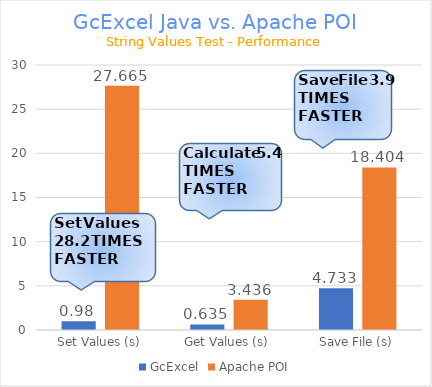
| Category | GcExcel | Apache POI |
|---|---|---|
| Set Values (s) | 0.98 | 27.665 |
| Get Values (s) | 0.635 | 3.436 |
| Save File (s) | 4.733 | 18.404 |